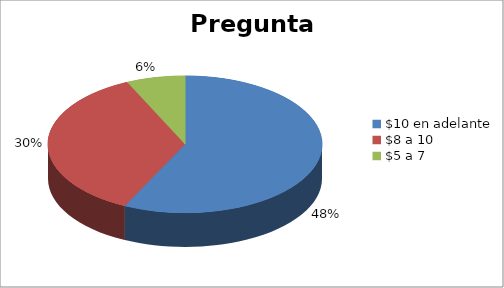
| Category | Series 0 |
|---|---|
| $10 en adelante | 0.475 |
| $8 a 10 | 0.298 |
| $5 a 7 | 0.058 |